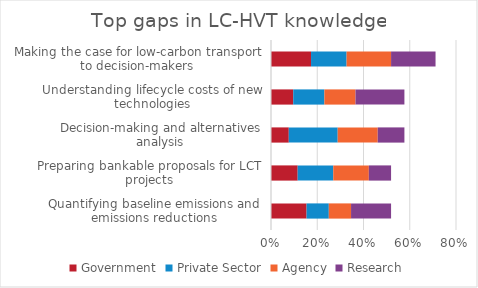
| Category | Government | Private Sector | Agency | Research |
|---|---|---|---|---|
| Quantifying baseline emissions and emissions reductions | 0.154 | 0.096 | 0.096 | 0.173 |
| Preparing bankable proposals for LCT projects | 0.115 | 0.154 | 0.154 | 0.096 |
| Decision-making and alternatives analysis | 0.077 | 0.212 | 0.173 | 0.115 |
| Understanding lifecycle costs of new technologies | 0.096 | 0.135 | 0.135 | 0.212 |
| Making the case for low-carbon transport to decision-makers | 0.173 | 0.154 | 0.192 | 0.192 |